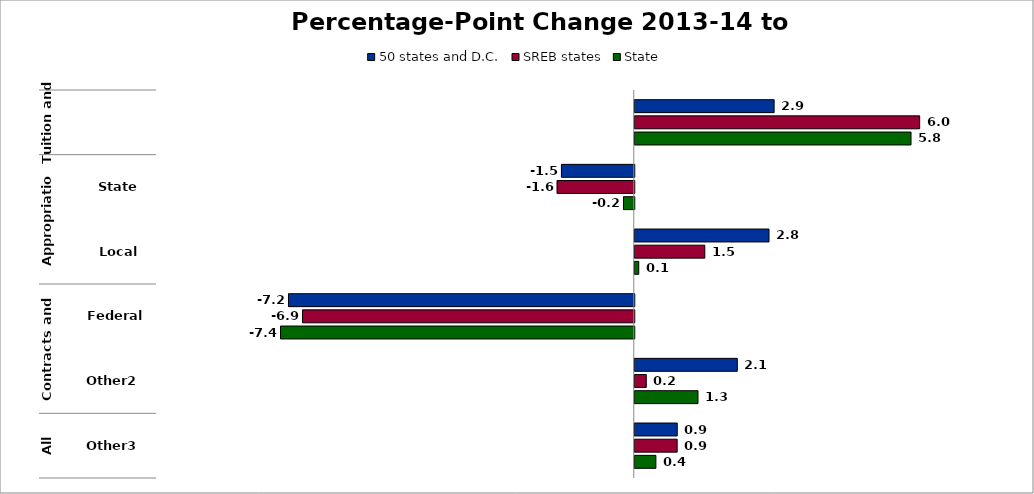
| Category | 50 states and D.C. | SREB states | State |
|---|---|---|---|
| 0 | 2.917 | 5.963 | 5.782 |
| 1 | -1.524 | -1.613 | -0.226 |
| 2 | 2.81 | 1.466 | 0.083 |
| 3 | -7.237 | -6.944 | -7.404 |
| 4 | 2.146 | 0.241 | 1.323 |
| 5 | 0.889 | 0.887 | 0.442 |